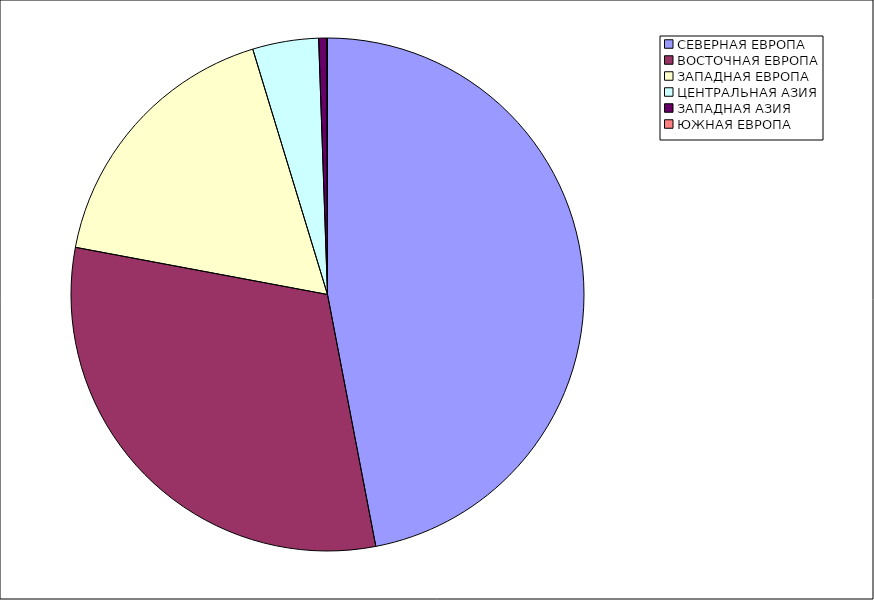
| Category | Оборот |
|---|---|
| СЕВЕРНАЯ ЕВРОПА | 46.982 |
| ВОСТОЧНАЯ ЕВРОПА | 30.962 |
| ЗАПАДНАЯ ЕВРОПА | 17.349 |
| ЦЕНТРАЛЬНАЯ АЗИЯ | 4.155 |
| ЗАПАДНАЯ АЗИЯ | 0.5 |
| ЮЖНАЯ ЕВРОПА | 0.05 |